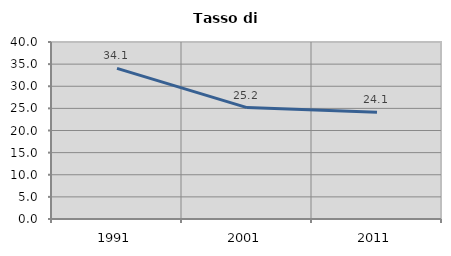
| Category | Tasso di disoccupazione   |
|---|---|
| 1991.0 | 34.054 |
| 2001.0 | 25.178 |
| 2011.0 | 24.109 |